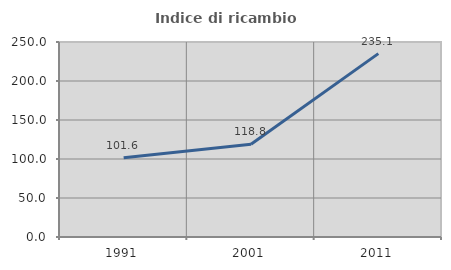
| Category | Indice di ricambio occupazionale  |
|---|---|
| 1991.0 | 101.575 |
| 2001.0 | 118.812 |
| 2011.0 | 235.065 |